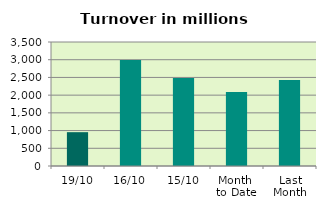
| Category | Series 0 |
|---|---|
| 19/10 | 954.677 |
| 16/10 | 2992.635 |
| 15/10 | 2484.322 |
| Month 
to Date | 2089.451 |
| Last
Month | 2424.403 |